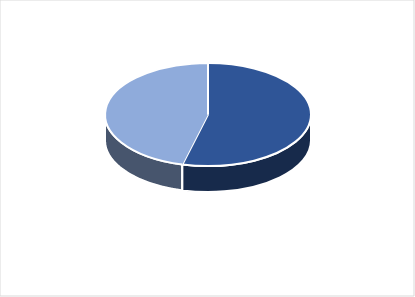
| Category | Series 0 |
|---|---|
| PRESUPUESTO VIGENTE PARA 2023 | 26432893 |
| PRESUPUESTO EJECUTADO  | 22514121.83 |
| PORCENTAJE DE EJECUCIÓN  | 0.852 |